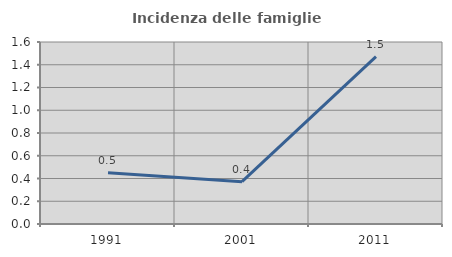
| Category | Incidenza delle famiglie numerose |
|---|---|
| 1991.0 | 0.45 |
| 2001.0 | 0.372 |
| 2011.0 | 1.471 |